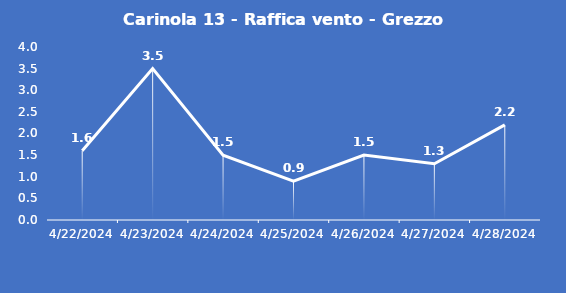
| Category | Carinola 13 - Raffica vento - Grezzo (m/s) |
|---|---|
| 4/22/24 | 1.6 |
| 4/23/24 | 3.5 |
| 4/24/24 | 1.5 |
| 4/25/24 | 0.9 |
| 4/26/24 | 1.5 |
| 4/27/24 | 1.3 |
| 4/28/24 | 2.2 |